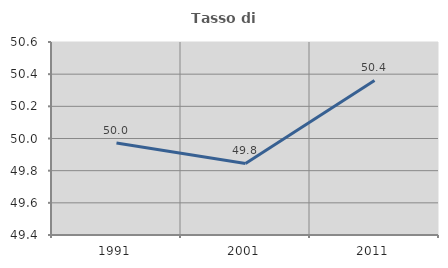
| Category | Tasso di occupazione   |
|---|---|
| 1991.0 | 49.972 |
| 2001.0 | 49.845 |
| 2011.0 | 50.361 |